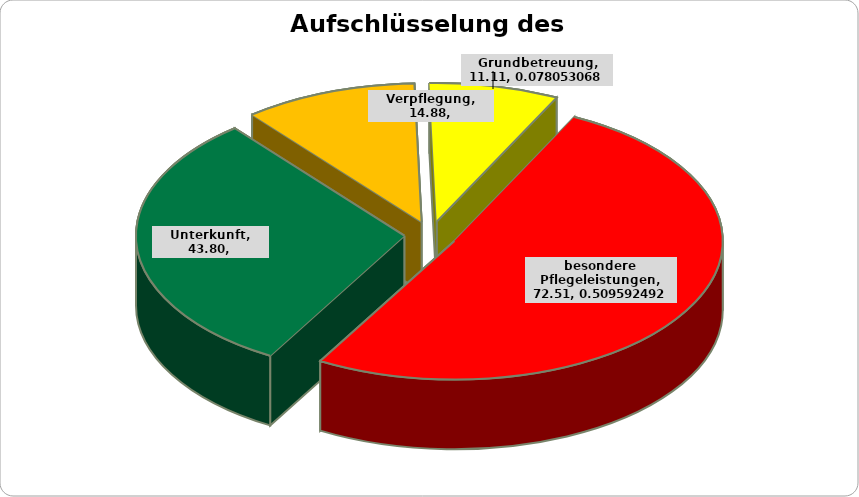
| Category | Betrag in EUR |
|---|---|
| Unterkunft | 43.798 |
| Verpflegung | 14.876 |
| Grundbetreuung | 11.106 |
| besondere Pflegeleistungen | 72.51 |